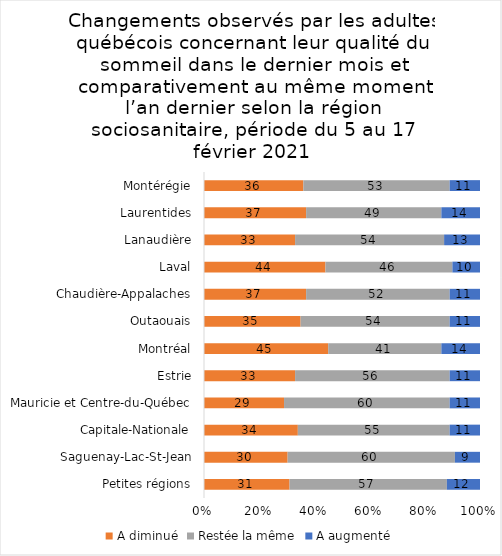
| Category | A diminué | Restée la même | A augmenté |
|---|---|---|---|
| Petites régions | 31 | 57 | 12 |
| Saguenay-Lac-St-Jean | 30 | 60 | 9 |
| Capitale-Nationale | 34 | 55 | 11 |
| Mauricie et Centre-du-Québec | 29 | 60 | 11 |
| Estrie | 33 | 56 | 11 |
| Montréal | 45 | 41 | 14 |
| Outaouais | 35 | 54 | 11 |
| Chaudière-Appalaches | 37 | 52 | 11 |
| Laval | 44 | 46 | 10 |
| Lanaudière | 33 | 54 | 13 |
| Laurentides | 37 | 49 | 14 |
| Montérégie | 36 | 53 | 11 |